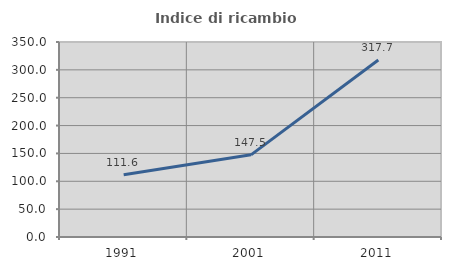
| Category | Indice di ricambio occupazionale  |
|---|---|
| 1991.0 | 111.594 |
| 2001.0 | 147.482 |
| 2011.0 | 317.708 |